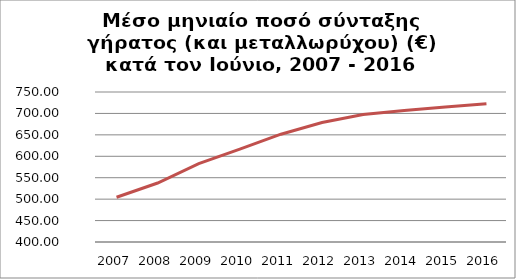
| Category | Series 1 |
|---|---|
| 2007.0 | 504.426 |
| 2008.0 | 537.591 |
| 2009.0 | 582.94 |
| 2010.0 | 616.567 |
| 2011.0 | 651.509 |
| 2012.0 | 678.951 |
| 2013.0 | 697.458 |
| 2014.0 | 707.063 |
| 2015.0 | 715.126 |
| 2016.0 | 722.83 |